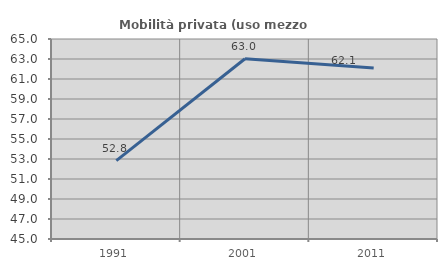
| Category | Mobilità privata (uso mezzo privato) |
|---|---|
| 1991.0 | 52.842 |
| 2001.0 | 63.021 |
| 2011.0 | 62.102 |